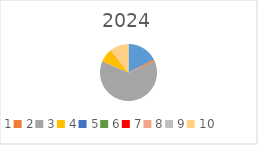
| Category | Series 0 |
|---|---|
| 1.0 | 1693408 |
| 2.0 | 116813 |
| 3.0 | 6103613 |
| 4.0 | 744321 |
| 5.0 | 0 |
| 6.0 | 0 |
| 7.0 | 9835 |
| 8.0 | 0 |
| 9.0 | 9100 |
| 10.0 | 1040463 |